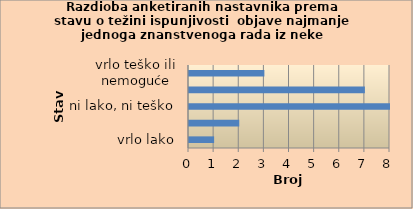
| Category | Series 0 |
|---|---|
| vrlo lako | 1 |
| lako | 2 |
| ni lako, ni teško | 8 |
| teško | 7 |
| vrlo teško ili nemoguće | 3 |